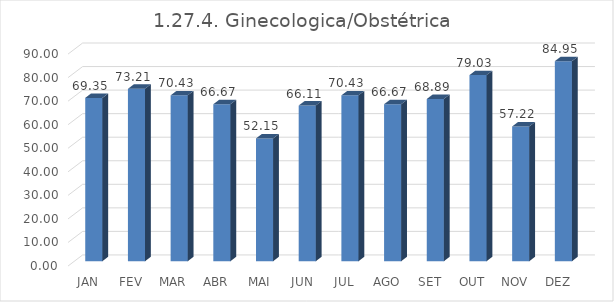
| Category | 1.27.4. Ginecologica/Obstétrica  |
|---|---|
|  JAN  | 69.355 |
|  FEV  | 73.214 |
|  MAR  | 70.43 |
|  ABR  | 66.667 |
|  MAI  | 52.151 |
|  JUN  | 66.111 |
|  JUL  | 70.43 |
|  AGO  | 66.667 |
|  SET  | 68.889 |
|  OUT  | 79.032 |
|  NOV  | 57.222 |
|  DEZ  | 84.946 |